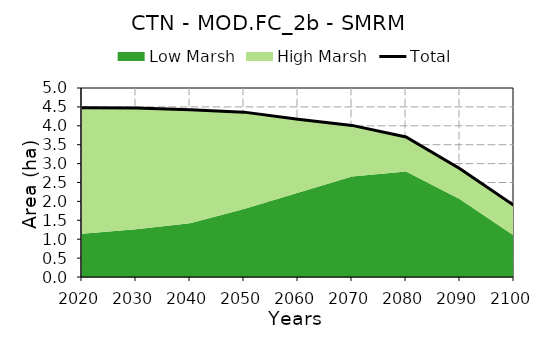
| Category | Total |
|---|---|
| 0 | 4.48 |
| 1 | 4.474 |
| 2 | 4.422 |
| 3 | 4.362 |
| 4 | 4.17 |
| 5 | 4.01 |
| 6 | 3.706 |
| 7 | 2.863 |
| 8 | 1.894 |